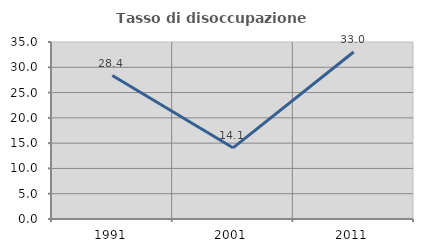
| Category | Tasso di disoccupazione giovanile  |
|---|---|
| 1991.0 | 28.369 |
| 2001.0 | 14.074 |
| 2011.0 | 33.028 |